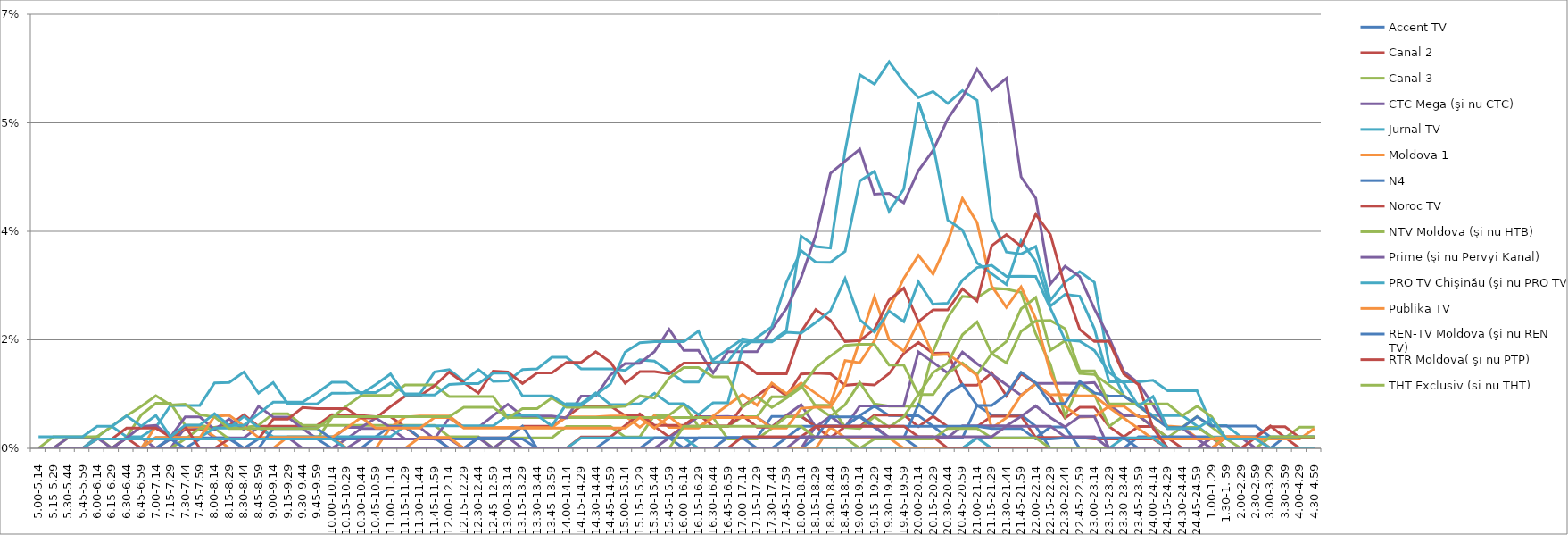
| Category | Accent TV | Canal 2 | Canal 3 | CTC Mega (şi nu CTC) | Jurnal TV | Moldova 1 | N4 | Noroc TV | NTV Moldova (şi nu HTB) | Prime (şi nu Pervyi Kanal) | PRO TV Chişinău (şi nu PRO TV) | Publika TV  | REN-TV Moldova (şi nu REN TV)  | RTR Moldova( şi nu PTP)  | THT Exclusiv (şi nu THT) | TV8 | TVC 21 | TVR MOLDOVA (şi nu TVR) | Canal Regional | Familia Domashniy | ITV | Moldova 2 | Alt canal |
|---|---|---|---|---|---|---|---|---|---|---|---|---|---|---|---|---|---|---|---|---|---|---|---|
| 5.00-5.14 | 0 | 0 | 0 | 0 | 0 | 0 | 0 | 0 | 0 | 0 | 0 | 0 | 0 | 0 | 0 | 0 | 0 | 0 | 0 | 0 | 0 | 0 | 0.002 |
| 5.15-5.29 | 0 | 0 | 0 | 0 | 0 | 0 | 0 | 0 | 0 | 0 | 0 | 0 | 0 | 0 | 0.002 | 0 | 0 | 0 | 0 | 0 | 0 | 0 | 0.002 |
| 5.30-5.44 | 0 | 0 | 0.002 | 0 | 0 | 0 | 0 | 0 | 0 | 0.002 | 0 | 0 | 0 | 0 | 0.002 | 0 | 0 | 0 | 0 | 0 | 0 | 0 | 0.002 |
| 5.45-5.59 | 0 | 0 | 0.002 | 0 | 0 | 0 | 0 | 0 | 0 | 0.002 | 0 | 0 | 0 | 0 | 0.002 | 0 | 0 | 0 | 0 | 0 | 0 | 0 | 0.002 |
| 6.00-6.14 | 0 | 0 | 0.002 | 0 | 0.002 | 0 | 0 | 0 | 0 | 0.002 | 0 | 0 | 0 | 0.002 | 0.002 | 0 | 0.002 | 0 | 0 | 0 | 0 | 0 | 0.004 |
| 6.15-6.29 | 0 | 0 | 0 | 0 | 0.004 | 0 | 0 | 0 | 0 | 0 | 0 | 0 | 0 | 0.002 | 0.004 | 0 | 0.002 | 0 | 0 | 0 | 0 | 0 | 0.004 |
| 6.30-6.44 | 0 | 0.002 | 0.002 | 0.002 | 0.002 | 0 | 0 | 0 | 0 | 0.002 | 0 | 0 | 0 | 0.003 | 0.005 | 0 | 0.002 | 0 | 0 | 0 | 0 | 0 | 0.005 |
| 6.45-6.59 | 0 | 0 | 0.005 | 0.002 | 0.002 | 0 | 0 | 0 | 0 | 0.004 | 0 | 0 | 0 | 0.003 | 0.007 | 0 | 0.002 | 0 | 0 | 0 | 0 | 0 | 0.004 |
| 7.00-7.14 | 0 | 0 | 0.007 | 0 | 0.003 | 0.004 | 0 | 0 | 0 | 0.004 | 0.002 | 0.002 | 0 | 0.003 | 0.008 | 0 | 0.002 | 0 | 0 | 0 | 0 | 0 | 0.005 |
| 7.15-7.29 | 0 | 0.002 | 0.007 | 0 | 0.007 | 0.002 | 0.002 | 0 | 0 | 0.002 | 0.002 | 0.002 | 0.002 | 0.002 | 0.007 | 0 | 0.002 | 0 | 0 | 0 | 0 | 0 | 0.002 |
| 7.30-7.44 | 0 | 0.003 | 0.004 | 0.003 | 0.007 | 0.003 | 0.002 | 0 | 0.002 | 0.005 | 0.002 | 0.002 | 0 | 0.004 | 0.007 | 0 | 0.002 | 0 | 0 | 0 | 0 | 0 | 0.004 |
| 7.45-7.59 | 0 | 0.003 | 0.004 | 0.003 | 0.007 | 0.004 | 0.002 | 0 | 0.003 | 0.005 | 0.002 | 0.002 | 0.002 | 0 | 0.005 | 0 | 0.002 | 0 | 0 | 0 | 0 | 0 | 0.004 |
| 8.00-8.14 | 0 | 0.003 | 0.003 | 0.002 | 0.011 | 0.002 | 0.002 | 0 | 0.003 | 0.003 | 0.003 | 0.005 | 0.002 | 0 | 0.005 | 0 | 0.002 | 0 | 0 | 0 | 0 | 0 | 0.006 |
| 8.15-8.29 | 0 | 0.004 | 0.003 | 0.002 | 0.011 | 0 | 0.002 | 0 | 0.002 | 0.005 | 0.003 | 0.005 | 0.002 | 0.002 | 0.003 | 0 | 0.002 | 0 | 0 | 0 | 0 | 0 | 0.004 |
| 8.30-8.44 | 0 | 0.005 | 0.003 | 0.002 | 0.012 | 0 | 0 | 0 | 0.002 | 0.003 | 0.005 | 0.004 | 0 | 0.002 | 0.003 | 0 | 0.002 | 0 | 0 | 0 | 0 | 0 | 0.004 |
| 8.45-8.59 | 0 | 0.004 | 0.004 | 0.003 | 0.009 | 0 | 0.002 | 0 | 0.002 | 0.007 | 0.003 | 0.002 | 0 | 0.002 | 0.003 | 0 | 0.002 | 0 | 0 | 0 | 0 | 0 | 0.006 |
| 9.00-9.14 | 0 | 0.004 | 0.006 | 0.002 | 0.011 | 0 | 0.002 | 0 | 0.002 | 0.005 | 0.002 | 0.002 | 0.003 | 0.005 | 0.003 | 0 | 0.002 | 0 | 0 | 0 | 0 | 0 | 0.007 |
| 9.15-9.29 | 0 | 0.004 | 0.006 | 0.002 | 0.007 | 0.002 | 0.002 | 0 | 0.002 | 0.005 | 0.002 | 0.002 | 0.003 | 0.005 | 0.003 | 0 | 0.002 | 0 | 0 | 0 | 0 | 0 | 0.007 |
| 9.30-9.44 | 0 | 0.004 | 0.004 | 0 | 0.007 | 0.002 | 0.002 | 0 | 0.002 | 0.003 | 0.002 | 0.002 | 0.003 | 0.007 | 0.003 | 0 | 0.002 | 0 | 0 | 0 | 0 | 0 | 0.007 |
| 9.45-9.59 | 0 | 0.004 | 0.004 | 0 | 0.007 | 0.002 | 0.002 | 0 | 0.002 | 0.002 | 0.002 | 0.002 | 0.003 | 0.006 | 0.003 | 0 | 0.002 | 0 | 0 | 0 | 0 | 0 | 0.009 |
| 10.00-10.14 | 0 | 0.005 | 0.004 | 0 | 0.009 | 0.002 | 0 | 0 | 0.005 | 0.002 | 0.002 | 0.002 | 0.002 | 0.006 | 0.005 | 0 | 0.002 | 0 | 0 | 0 | 0 | 0 | 0.011 |
| 10.15-10.29 | 0 | 0.005 | 0.004 | 0.002 | 0.009 | 0 | 0 | 0 | 0.007 | 0.003 | 0.002 | 0.003 | 0.002 | 0.006 | 0.005 | 0 | 0 | 0 | 0 | 0 | 0 | 0 | 0.011 |
| 10.30-10.44 | 0 | 0.005 | 0.004 | 0.003 | 0.009 | 0 | 0 | 0 | 0.009 | 0.003 | 0.002 | 0.005 | 0.002 | 0.005 | 0.005 | 0.002 | 0 | 0 | 0 | 0 | 0 | 0 | 0.009 |
| 10.45-10.59 | 0 | 0.005 | 0.004 | 0.003 | 0.009 | 0 | 0.002 | 0 | 0.009 | 0.005 | 0.002 | 0.003 | 0.002 | 0.005 | 0.005 | 0.002 | 0 | 0 | 0 | 0 | 0 | 0 | 0.01 |
| 11.00-11.14 | 0 | 0.005 | 0.004 | 0.003 | 0.011 | 0.003 | 0.004 | 0 | 0.009 | 0.003 | 0.002 | 0.003 | 0.002 | 0.007 | 0.005 | 0.002 | 0 | 0 | 0 | 0 | 0 | 0 | 0.012 |
| 11.15-11.29 | 0 | 0.003 | 0.004 | 0.002 | 0.009 | 0.005 | 0.004 | 0 | 0.01 | 0.003 | 0.004 | 0.003 | 0.002 | 0.008 | 0.005 | 0.002 | 0 | 0 | 0 | 0 | 0 | 0 | 0.009 |
| 11.30-11.44 | 0 | 0.002 | 0.004 | 0.002 | 0.009 | 0.005 | 0.002 | 0 | 0.01 | 0.003 | 0.004 | 0.003 | 0.002 | 0.008 | 0.005 | 0.002 | 0 | 0.002 | 0 | 0 | 0 | 0 | 0.009 |
| 11.45-11.59 | 0 | 0.002 | 0.004 | 0.002 | 0.012 | 0.005 | 0.002 | 0 | 0.01 | 0.002 | 0.004 | 0.005 | 0.002 | 0.01 | 0.005 | 0.002 | 0 | 0.002 | 0 | 0 | 0 | 0 | 0.009 |
| 12.00-12.14 | 0 | 0.002 | 0.002 | 0 | 0.013 | 0.005 | 0 | 0 | 0.008 | 0.005 | 0.004 | 0.005 | 0.002 | 0.012 | 0.005 | 0.002 | 0 | 0.002 | 0 | 0 | 0 | 0 | 0.01 |
| 12.15-12.29 | 0 | 0.002 | 0.002 | 0 | 0.011 | 0.003 | 0 | 0 | 0.008 | 0.003 | 0.004 | 0.003 | 0.002 | 0.011 | 0.007 | 0 | 0 | 0 | 0 | 0 | 0 | 0 | 0.01 |
| 12.30-12.44 | 0 | 0.002 | 0.002 | 0.002 | 0.013 | 0.003 | 0.002 | 0 | 0.008 | 0.003 | 0.004 | 0.003 | 0.002 | 0.009 | 0.007 | 0 | 0 | 0 | 0 | 0 | 0 | 0 | 0.01 |
| 12.45-12.59 | 0 | 0.002 | 0 | 0 | 0.011 | 0.003 | 0.002 | 0 | 0.008 | 0.005 | 0.004 | 0.003 | 0.002 | 0.012 | 0.007 | 0 | 0 | 0 | 0 | 0 | 0 | 0 | 0.012 |
| 13.00-13.14 | 0 | 0.002 | 0.002 | 0.002 | 0.011 | 0.003 | 0.002 | 0 | 0.005 | 0.007 | 0.005 | 0.003 | 0.002 | 0.012 | 0.005 | 0 | 0 | 0 | 0 | 0 | 0 | 0 | 0.012 |
| 13.15-13.29 | 0 | 0.004 | 0.002 | 0 | 0.013 | 0.003 | 0.004 | 0 | 0.005 | 0.005 | 0.005 | 0.003 | 0.002 | 0.01 | 0.006 | 0 | 0 | 0 | 0 | 0 | 0 | 0 | 0.008 |
| 13.30-13.44 | 0 | 0.004 | 0.002 | 0 | 0.013 | 0.003 | 0 | 0 | 0.005 | 0.005 | 0.005 | 0.003 | 0 | 0.012 | 0.006 | 0 | 0 | 0 | 0 | 0 | 0 | 0 | 0.008 |
| 13.45-13.59 | 0 | 0.004 | 0.002 | 0 | 0.015 | 0.003 | 0 | 0 | 0.005 | 0.005 | 0.004 | 0.003 | 0 | 0.012 | 0.008 | 0 | 0 | 0 | 0 | 0 | 0 | 0 | 0.008 |
| 14.00-14.14 | 0 | 0.005 | 0.004 | 0 | 0.015 | 0.005 | 0 | 0 | 0.005 | 0.005 | 0.007 | 0.003 | 0 | 0.014 | 0.007 | 0 | 0 | 0 | 0 | 0 | 0 | 0 | 0.007 |
| 14.15-14.29 | 0 | 0.007 | 0.004 | 0 | 0.013 | 0.005 | 0 | 0.002 | 0.005 | 0.008 | 0.007 | 0.003 | 0 | 0.014 | 0.007 | 0 | 0.002 | 0 | 0 | 0 | 0 | 0 | 0.007 |
| 14.30-14.44 | 0 | 0.007 | 0.004 | 0 | 0.013 | 0.005 | 0 | 0.002 | 0.005 | 0.008 | 0.009 | 0.003 | 0 | 0.016 | 0.007 | 0 | 0.002 | 0 | 0 | 0 | 0 | 0 | 0.009 |
| 14.45-14.59 | 0 | 0.007 | 0.004 | 0 | 0.013 | 0.005 | 0 | 0.002 | 0.005 | 0.012 | 0.007 | 0.003 | 0.002 | 0.014 | 0.007 | 0 | 0.002 | 0 | 0 | 0 | 0 | 0 | 0.01 |
| 15.00-15.14 | 0 | 0.005 | 0.002 | 0 | 0.013 | 0.005 | 0 | 0.004 | 0.005 | 0.014 | 0.007 | 0.003 | 0.002 | 0.01 | 0.007 | 0 | 0.002 | 0 | 0 | 0 | 0 | 0 | 0.016 |
| 15.15-15.29 | 0 | 0.005 | 0.002 | 0 | 0.014 | 0.003 | 0 | 0.006 | 0.005 | 0.014 | 0.007 | 0.005 | 0.002 | 0.012 | 0.008 | 0 | 0.002 | 0 | 0 | 0 | 0 | 0 | 0.017 |
| 15.30-15.44 | 0 | 0.004 | 0.005 | 0 | 0.014 | 0.005 | 0 | 0.004 | 0.005 | 0.016 | 0.009 | 0.003 | 0.002 | 0.012 | 0.008 | 0 | 0.002 | 0 | 0.002 | 0 | 0 | 0 | 0.017 |
| 15.45-15.59 | 0 | 0.002 | 0.005 | 0.002 | 0.012 | 0.003 | 0 | 0.004 | 0.005 | 0.019 | 0.007 | 0.005 | 0.002 | 0.012 | 0.011 | 0 | 0.002 | 0 | 0.002 | 0 | 0 | 0 | 0.017 |
| 16.00-16.14 | 0 | 0.004 | 0.007 | 0.003 | 0.011 | 0.003 | 0 | 0.004 | 0.005 | 0.016 | 0.007 | 0.003 | 0 | 0.014 | 0.013 | 0 | 0.002 | 0 | 0.002 | 0 | 0.004 | 0 | 0.017 |
| 16.15-16.29 | 0 | 0.004 | 0.004 | 0.005 | 0.011 | 0.003 | 0 | 0.005 | 0.005 | 0.016 | 0.005 | 0.003 | 0.002 | 0.014 | 0.013 | 0 | 0 | 0 | 0.002 | 0 | 0.004 | 0 | 0.019 |
| 16.30-16.44 | 0 | 0.004 | 0.004 | 0.005 | 0.014 | 0.005 | 0 | 0.004 | 0.005 | 0.012 | 0.007 | 0.005 | 0.002 | 0.014 | 0.012 | 0 | 0 | 0 | 0.002 | 0 | 0.004 | 0 | 0.014 |
| 16.45-16.59 | 0 | 0.004 | 0.004 | 0.005 | 0.016 | 0.007 | 0.002 | 0.004 | 0.002 | 0.016 | 0.007 | 0.005 | 0.002 | 0.014 | 0.012 | 0 | 0 | 0 | 0.002 | 0 | 0.004 | 0 | 0.014 |
| 17.00-17.14 | 0 | 0.007 | 0.005 | 0.005 | 0.018 | 0.009 | 0.002 | 0.005 | 0.002 | 0.016 | 0.016 | 0.005 | 0.002 | 0.014 | 0.007 | 0 | 0 | 0 | 0.002 | 0.002 | 0.004 | 0 | 0.017 |
| 17.15-17.29 | 0 | 0.008 | 0.005 | 0.005 | 0.017 | 0.007 | 0.002 | 0.003 | 0.002 | 0.016 | 0.018 | 0.005 | 0 | 0.012 | 0.008 | 0 | 0 | 0 | 0.002 | 0.002 | 0.004 | 0 | 0.017 |
| 17.30-17.44 | 0 | 0.01 | 0.008 | 0.003 | 0.017 | 0.011 | 0.005 | 0.003 | 0.003 | 0.019 | 0.02 | 0.003 | 0 | 0.012 | 0.007 | 0 | 0 | 0 | 0.002 | 0.002 | 0.004 | 0 | 0.017 |
| 17.45-17.59 | 0.002 | 0.008 | 0.008 | 0.005 | 0.019 | 0.009 | 0.005 | 0.005 | 0.005 | 0.023 | 0.027 | 0.003 | 0 | 0.012 | 0.008 | 0 | 0 | 0 | 0.002 | 0.002 | 0.004 | 0 | 0.019 |
| 18.00-18.14 | 0.002 | 0.012 | 0.01 | 0.007 | 0.034 | 0.011 | 0.005 | 0.005 | 0.005 | 0.028 | 0.032 | 0.006 | 0 | 0.019 | 0.01 | 0 | 0 | 0 | 0.004 | 0.002 | 0.004 | 0.002 | 0.019 |
| 18.15-18.29 | 0.002 | 0.012 | 0.007 | 0.003 | 0.033 | 0.009 | 0.004 | 0.003 | 0.007 | 0.034 | 0.03 | 0.007 | 0.002 | 0.022 | 0.013 | 0.004 | 0 | 0 | 0.004 | 0.004 | 0.002 | 0.002 | 0.02 |
| 18.30-18.44 | 0.002 | 0.012 | 0.005 | 0.005 | 0.032 | 0.007 | 0.004 | 0.002 | 0.007 | 0.044 | 0.03 | 0.007 | 0.005 | 0.021 | 0.015 | 0.004 | 0 | 0.003 | 0.004 | 0.004 | 0.002 | 0.002 | 0.022 |
| 18.45-18.59 | 0.002 | 0.01 | 0.007 | 0.003 | 0.048 | 0.014 | 0.004 | 0.003 | 0.003 | 0.046 | 0.032 | 0.01 | 0.005 | 0.017 | 0.017 | 0.004 | 0 | 0.002 | 0.004 | 0.004 | 0.002 | 0.002 | 0.027 |
| 19.00-19.14 | 0.002 | 0.01 | 0.011 | 0.007 | 0.06 | 0.014 | 0.005 | 0.003 | 0.003 | 0.048 | 0.043 | 0.017 | 0.005 | 0.017 | 0.017 | 0.004 | 0 | 0.002 | 0.005 | 0.004 | 0 | 0.002 | 0.021 |
| 19.15-19.29 | 0.002 | 0.01 | 0.007 | 0.007 | 0.059 | 0.017 | 0.007 | 0.005 | 0.005 | 0.041 | 0.045 | 0.024 | 0.003 | 0.019 | 0.017 | 0.004 | 0 | 0.002 | 0.004 | 0.004 | 0.002 | 0.002 | 0.019 |
| 19.30-19.44 | 0.002 | 0.012 | 0.007 | 0.007 | 0.062 | 0.023 | 0.005 | 0.005 | 0.003 | 0.041 | 0.038 | 0.018 | 0.002 | 0.024 | 0.013 | 0.002 | 0 | 0.002 | 0.004 | 0.004 | 0.002 | 0.002 | 0.022 |
| 19.45-19.59 | 0.002 | 0.015 | 0.007 | 0.007 | 0.059 | 0.027 | 0.005 | 0.005 | 0.005 | 0.04 | 0.042 | 0.016 | 0.002 | 0.026 | 0.013 | 0.002 | 0 | 0 | 0.004 | 0.004 | 0.002 | 0.002 | 0.02 |
| 20.00-20.14 | 0 | 0.017 | 0.007 | 0.016 | 0.057 | 0.031 | 0.005 | 0.003 | 0.009 | 0.045 | 0.056 | 0.02 | 0.007 | 0.02 | 0.009 | 0.002 | 0 | 0 | 0.004 | 0.002 | 0.002 | 0.002 | 0.027 |
| 20.15-20.29 | 0 | 0.015 | 0.016 | 0.014 | 0.058 | 0.028 | 0.004 | 0.005 | 0.009 | 0.048 | 0.049 | 0.015 | 0.005 | 0.022 | 0.012 | 0.002 | 0 | 0 | 0.004 | 0.002 | 0.002 | 0.002 | 0.023 |
| 20.30-20.44 | 0 | 0.015 | 0.021 | 0.012 | 0.056 | 0.033 | 0.002 | 0.003 | 0.012 | 0.053 | 0.037 | 0.015 | 0.009 | 0.022 | 0.014 | 0.002 | 0 | 0 | 0.004 | 0 | 0.003 | 0.002 | 0.023 |
| 20.45-20.59 | 0 | 0.01 | 0.025 | 0.016 | 0.058 | 0.04 | 0.002 | 0.003 | 0.014 | 0.057 | 0.035 | 0.014 | 0.01 | 0.026 | 0.018 | 0.004 | 0 | 0 | 0.004 | 0 | 0.003 | 0.002 | 0.027 |
| 21.00-21.14 | 0.002 | 0.01 | 0.024 | 0.014 | 0.056 | 0.036 | 0.007 | 0.003 | 0.012 | 0.061 | 0.03 | 0.012 | 0.007 | 0.024 | 0.02 | 0.004 | 0.002 | 0 | 0.004 | 0 | 0.003 | 0.002 | 0.029 |
| 21.15-21.29 | 0.002 | 0.012 | 0.026 | 0.012 | 0.037 | 0.026 | 0.005 | 0.005 | 0.015 | 0.058 | 0.028 | 0.003 | 0.007 | 0.033 | 0.015 | 0.004 | 0 | 0 | 0.003 | 0 | 0.002 | 0.002 | 0.03 |
| 21.30-21.44 | 0.002 | 0.008 | 0.026 | 0.01 | 0.032 | 0.023 | 0.005 | 0.005 | 0.017 | 0.06 | 0.026 | 0.005 | 0.009 | 0.034 | 0.014 | 0.004 | 0 | 0 | 0.003 | 0 | 0.002 | 0.004 | 0.028 |
| 21.45-21.59 | 0.002 | 0.012 | 0.025 | 0.009 | 0.031 | 0.026 | 0.005 | 0.005 | 0.022 | 0.044 | 0.033 | 0.009 | 0.012 | 0.033 | 0.019 | 0.005 | 0 | 0 | 0.003 | 0 | 0.002 | 0.004 | 0.028 |
| 22.00-22.14 | 0.002 | 0.01 | 0.018 | 0.01 | 0.033 | 0.021 | 0.004 | 0.002 | 0.024 | 0.04 | 0.03 | 0.01 | 0.011 | 0.038 | 0.021 | 0.007 | 0 | 0 | 0.002 | 0 | 0.002 | 0.004 | 0.028 |
| 22.15-22.29 | 0.003 | 0.008 | 0.014 | 0.01 | 0.024 | 0.012 | 0 | 0.002 | 0.016 | 0.027 | 0.023 | 0.009 | 0.007 | 0.034 | 0.021 | 0.005 | 0 | 0 | 0.002 | 0 | 0 | 0.004 | 0.023 |
| 22.30-22.44 | 0.003 | 0.005 | 0.005 | 0.011 | 0.027 | 0.007 | 0 | 0.002 | 0.017 | 0.029 | 0.025 | 0.009 | 0.007 | 0.026 | 0.019 | 0.003 | 0 | 0 | 0.002 | 0 | 0 | 0.002 | 0.017 |
| 22.45-22.59 | 0 | 0.007 | 0.01 | 0.01 | 0.029 | 0.005 | 0 | 0.002 | 0.012 | 0.028 | 0.025 | 0.008 | 0.011 | 0.019 | 0.012 | 0.005 | 0 | 0 | 0.002 | 0 | 0 | 0.002 | 0.017 |
| 23.00-23.14 | 0 | 0.007 | 0.009 | 0.011 | 0.027 | 0.005 | 0 | 0.002 | 0.012 | 0.023 | 0.019 | 0.008 | 0.009 | 0.017 | 0.012 | 0.005 | 0 | 0 | 0.002 | 0 | 0 | 0.002 | 0.016 |
| 23.15-23.29 | 0 | 0.004 | 0.004 | 0.007 | 0.014 | 0.007 | 0 | 0.002 | 0.01 | 0.018 | 0.011 | 0.007 | 0.008 | 0.017 | 0.007 | 0 | 0 | 0 | 0.002 | 0 | 0 | 0 | 0.012 |
| 23.30-23.44 | 0 | 0.002 | 0.005 | 0.005 | 0.008 | 0.007 | 0 | 0.002 | 0.009 | 0.012 | 0.011 | 0.005 | 0.008 | 0.012 | 0.007 | 0 | 0.002 | 0 | 0.002 | 0 | 0 | 0 | 0.011 |
| 23.45-23.59 | 0 | 0.004 | 0.005 | 0.005 | 0.007 | 0.005 | 0.002 | 0.002 | 0.007 | 0.011 | 0.011 | 0.003 | 0.007 | 0.01 | 0.007 | 0 | 0.002 | 0 | 0 | 0 | 0 | 0 | 0.007 |
| 24.00-24.14 | 0 | 0.004 | 0.003 | 0.003 | 0.005 | 0.005 | 0.002 | 0.002 | 0.005 | 0.007 | 0.011 | 0.002 | 0.005 | 0.003 | 0.007 | 0 | 0.002 | 0 | 0 | 0 | 0 | 0 | 0.008 |
| 24.15-24.29 | 0 | 0.002 | 0.002 | 0 | 0.005 | 0.004 | 0.002 | 0 | 0.003 | 0.003 | 0.009 | 0.002 | 0.003 | 0 | 0.007 | 0 | 0 | 0 | 0 | 0 | 0 | 0 | 0.003 |
| 24.30-24.44 | 0 | 0 | 0.003 | 0 | 0.005 | 0.003 | 0.002 | 0 | 0.003 | 0.003 | 0.009 | 0.002 | 0.003 | 0 | 0.005 | 0 | 0 | 0 | 0 | 0 | 0 | 0 | 0.003 |
| 24.45-24.59 | 0 | 0 | 0.005 | 0 | 0.004 | 0.002 | 0.002 | 0 | 0.003 | 0.002 | 0.009 | 0.002 | 0.005 | 0 | 0.007 | 0 | 0 | 0 | 0 | 0 | 0 | 0 | 0.003 |
| 1.00-1.29 | 0 | 0.002 | 0.003 | 0.002 | 0.002 | 0.002 | 0.002 | 0 | 0.002 | 0 | 0.004 | 0.002 | 0.004 | 0 | 0.005 | 0 | 0 | 0 | 0 | 0 | 0 | 0 | 0.005 |
| 1.30-1. 59 | 0 | 0 | 0.002 | 0.002 | 0.002 | 0.002 | 0 | 0.002 | 0 | 0 | 0.004 | 0.002 | 0.004 | 0 | 0.002 | 0 | 0 | 0.002 | 0 | 0 | 0 | 0 | 0.002 |
| 2.00-2.29 | 0 | 0 | 0.002 | 0.002 | 0.002 | 0.002 | 0 | 0.002 | 0 | 0 | 0.002 | 0.002 | 0.004 | 0 | 0 | 0 | 0 | 0.002 | 0 | 0 | 0 | 0 | 0.002 |
| 2.30-2.59 | 0 | 0 | 0.002 | 0 | 0.002 | 0.002 | 0 | 0.002 | 0 | 0 | 0.002 | 0.002 | 0.004 | 0.002 | 0 | 0 | 0 | 0.002 | 0 | 0 | 0 | 0 | 0.002 |
| 3.00-3.29 | 0 | 0 | 0.002 | 0 | 0 | 0.002 | 0 | 0.004 | 0 | 0 | 0.002 | 0.002 | 0.002 | 0.003 | 0.002 | 0 | 0 | 0 | 0 | 0 | 0 | 0 | 0 |
| 3.30-3.59 | 0 | 0 | 0.002 | 0 | 0 | 0.002 | 0.002 | 0.002 | 0 | 0 | 0.002 | 0.002 | 0.002 | 0.003 | 0.002 | 0 | 0 | 0 | 0 | 0 | 0 | 0 | 0 |
| 4.00-4.29 | 0 | 0 | 0.003 | 0 | 0 | 0.002 | 0.002 | 0 | 0 | 0 | 0.002 | 0.002 | 0.002 | 0.002 | 0.002 | 0 | 0 | 0 | 0 | 0 | 0 | 0 | 0 |
| 4.30-4.59 | 0 | 0 | 0.003 | 0 | 0 | 0.002 | 0.002 | 0 | 0 | 0 | 0.002 | 0.003 | 0.002 | 0.002 | 0.002 | 0 | 0 | 0 | 0 | 0 | 0 | 0 | 0 |